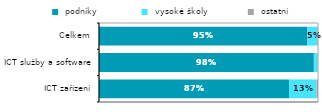
| Category |  podniky  |  vysoké školy |  ostatní  |
|---|---|---|---|
|   ICT zařízení | 0.868 | 0.126 | 0.007 |
|  ICT služby a software | 0.981 | 0.017 | 0.002 |
| Celkem | 0.951 | 0.046 | 0.003 |